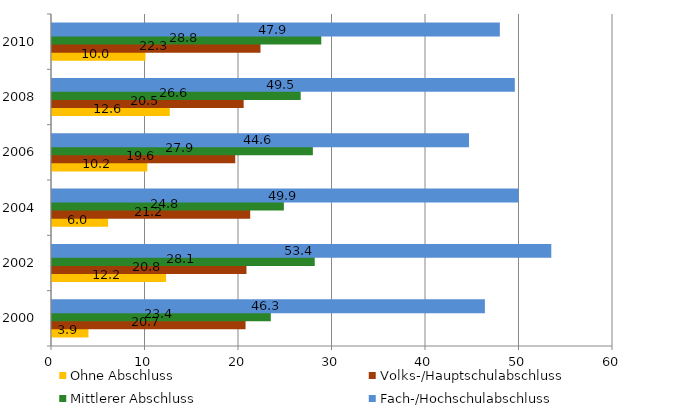
| Category | Ohne Abschluss | Volks-/Hauptschulabschluss | Mittlerer Abschluss | Fach-/Hochschulabschluss |
|---|---|---|---|---|
| 2000.0 | 3.9 | 20.7 | 23.4 | 46.3 |
| 2002.0 | 12.2 | 20.8 | 28.1 | 53.4 |
| 2004.0 | 6 | 21.2 | 24.8 | 49.9 |
| 2006.0 | 10.2 | 19.6 | 27.9 | 44.6 |
| 2008.0 | 12.6 | 20.5 | 26.6 | 49.5 |
| 2010.0 | 10 | 22.3 | 28.8 | 47.9 |